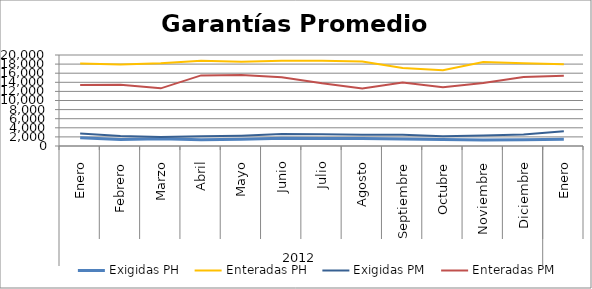
| Category | Exigidas PH | Enteradas PH | Exigidas PM | Enteradas PM |
|---|---|---|---|---|
| 0 | 1828.564 | 18155.583 | 2744.93 | 13413.991 |
| 1 | 1451.155 | 17917.734 | 2215.902 | 13440.832 |
| 2 | 1587.31 | 18166.129 | 1968.766 | 12673.714 |
| 3 | 1353.003 | 18741.256 | 2118.782 | 15515.723 |
| 4 | 1464.668 | 18540.927 | 2278.002 | 15625.393 |
| 5 | 1719.43 | 18734.539 | 2626.915 | 15127.903 |
| 6 | 1674.023 | 18761.463 | 2556.575 | 13766.49 |
| 7 | 1647.243 | 18544.546 | 2463.76 | 12637.427 |
| 8 | 1556.152 | 17124.972 | 2459.803 | 13929.715 |
| 9 | 1402.926 | 16653.067 | 2169.047 | 12937.81 |
| 10 | 1329.011 | 18467.462 | 2322.009 | 13825.53 |
| 11 | 1379.519 | 18204.98 | 2522.413 | 15188.776 |
| 12 | 1462.675 | 17957.148 | 3246.817 | 15415.235 |